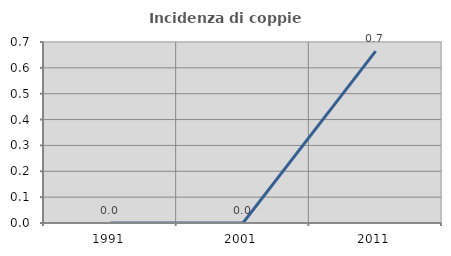
| Category | Incidenza di coppie miste |
|---|---|
| 1991.0 | 0 |
| 2001.0 | 0 |
| 2011.0 | 0.664 |